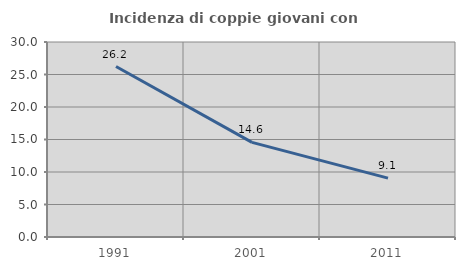
| Category | Incidenza di coppie giovani con figli |
|---|---|
| 1991.0 | 26.228 |
| 2001.0 | 14.561 |
| 2011.0 | 9.057 |